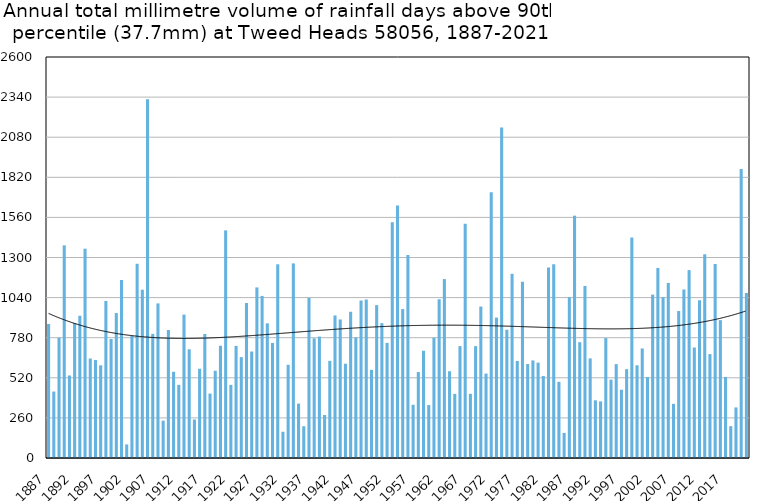
| Category | Annual total mm in days above 90th percentile |
|---|---|
| 1887 | 869.1 |
| 1888 | 431 |
| 1889 | 780.5 |
| 1890 | 1378.9 |
| 1891 | 535.1 |
| 1892 | 875.1 |
| 1893 | 922.4 |
| 1894 | 1357.1 |
| 1895 | 645.1 |
| 1896 | 635 |
| 1897 | 600.9 |
| 1898 | 1018.3 |
| 1899 | 771.7 |
| 1900 | 939.8 |
| 1901 | 1153.6 |
| 1902 | 87.9 |
| 1903 | 793.5 |
| 1904 | 1259.3 |
| 1905 | 1091.1 |
| 1906 | 2326 |
| 1907 | 804.7 |
| 1908 | 1002.3 |
| 1909 | 242.1 |
| 1910 | 830 |
| 1911 | 559.1 |
| 1912 | 474.1 |
| 1913 | 929.9 |
| 1914 | 704.8 |
| 1915 | 249.7 |
| 1916 | 578.8 |
| 1917 | 803.8 |
| 1918 | 417.6 |
| 1919 | 565.7 |
| 1920 | 727.9 |
| 1921 | 1475.9 |
| 1922 | 474.2 |
| 1923 | 726.9 |
| 1924 | 654 |
| 1925 | 1004.5 |
| 1926 | 690.4 |
| 1927 | 1106 |
| 1928 | 1050.9 |
| 1929 | 873.3 |
| 1930 | 745.5 |
| 1931 | 1255.9 |
| 1932 | 170.2 |
| 1933 | 604.1 |
| 1934 | 1261.7 |
| 1935 | 352.4 |
| 1936 | 206 |
| 1937 | 1038.4 |
| 1938 | 776 |
| 1939 | 787.3 |
| 1940 | 278.9 |
| 1941 | 629.8 |
| 1942 | 924.3 |
| 1943 | 898.3 |
| 1944 | 611.3 |
| 1945 | 948.2 |
| 1946 | 781.3 |
| 1947 | 1021.1 |
| 1948 | 1027.6 |
| 1949 | 571.4 |
| 1950 | 991.1 |
| 1951 | 874.2 |
| 1952 | 746.5 |
| 1953 | 1528.5 |
| 1954 | 1637.8 |
| 1955 | 965.7 |
| 1956 | 1316.1 |
| 1957 | 345 |
| 1958 | 557.3 |
| 1959 | 695.6 |
| 1960 | 343 |
| 1961 | 779.7 |
| 1962 | 1029.4 |
| 1963 | 1160 |
| 1964 | 562.4 |
| 1965 | 415.6 |
| 1966 | 725.5 |
| 1967 | 1518.9 |
| 1968 | 416 |
| 1969 | 725.3 |
| 1970 | 982.2 |
| 1971 | 547.3 |
| 1972 | 1722.7 |
| 1973 | 910.4 |
| 1974 | 2143.1 |
| 1975 | 831.4 |
| 1976 | 1194.4 |
| 1977 | 629 |
| 1978 | 1142.6 |
| 1979 | 609.2 |
| 1980 | 632.6 |
| 1981 | 618.5 |
| 1982 | 532 |
| 1983 | 1234.4 |
| 1984 | 1256.1 |
| 1985 | 493.5 |
| 1986 | 162.8 |
| 1987 | 1042.8 |
| 1988 | 1571.3 |
| 1989 | 750.8 |
| 1990 | 1115.6 |
| 1991 | 645.9 |
| 1992 | 374 |
| 1993 | 367 |
| 1994 | 777.6 |
| 1995 | 507.8 |
| 1996 | 608.6 |
| 1997 | 442.6 |
| 1998 | 576 |
| 1999 | 1429.5 |
| 2000 | 601.2 |
| 2001 | 710.2 |
| 2002 | 525.2 |
| 2003 | 1059.4 |
| 2004 | 1232.4 |
| 2005 | 1042.4 |
| 2006 | 1135.2 |
| 2007 | 351.2 |
| 2008 | 952.8 |
| 2009 | 1092.6 |
| 2010 | 1218.4 |
| 2011 | 716.2 |
| 2012 | 1023.6 |
| 2013 | 1320.8 |
| 2014 | 673.6 |
| 2015 | 1257.8 |
| 2016 | 893.8 |
| 2017 | 525.4 |
| 2018 | 206.2 |
| 2019 | 328 |
| 2020 | 1874.6 |
| 2021 | 1069.6 |